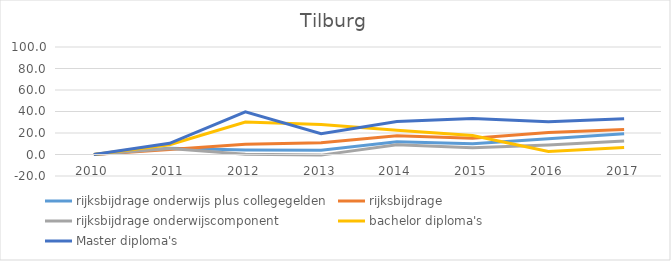
| Category | rijksbijdrage onderwijs plus collegegelden | rijksbijdrage  | rijksbijdrage onderwijscomponent | bachelor diploma's | Master diploma's |
|---|---|---|---|---|---|
| 2010.0 | 0 | 0 | 0 | 0 | 0 |
| 2011.0 | 5.779 | 4.665 | 5.498 | 9.078 | 10.406 |
| 2012.0 | 4.167 | 9.534 | 0.132 | 30.161 | 39.742 |
| 2013.0 | 3.932 | 10.899 | -0.579 | 27.818 | 19.376 |
| 2014.0 | 11.808 | 17.531 | 9.02 | 22.621 | 30.624 |
| 2015.0 | 10.002 | 15.019 | 6.278 | 17.57 | 33.399 |
| 2016.0 | 14.721 | 20.433 | 8.946 | 2.855 | 30.476 |
| 2017.0 | 19.287 | 23.274 | 12.623 | 6.515 | 33.251 |